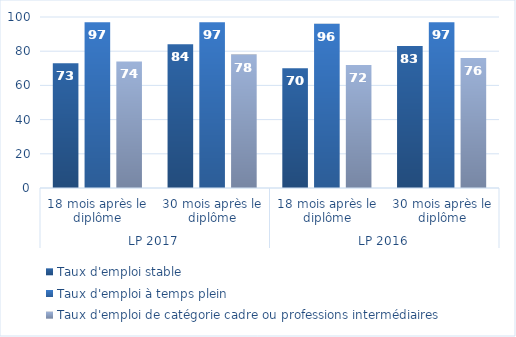
| Category | Taux d'emploi stable | Taux d'emploi à temps plein | Taux d'emploi de catégorie cadre ou professions intermédiaires |
|---|---|---|---|
| 0 | 73 | 97 | 74 |
| 1 | 84 | 97 | 78 |
| 2 | 70 | 96 | 72 |
| 3 | 83 | 97 | 76 |